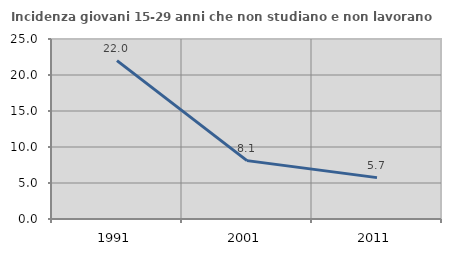
| Category | Incidenza giovani 15-29 anni che non studiano e non lavorano  |
|---|---|
| 1991.0 | 22 |
| 2001.0 | 8.108 |
| 2011.0 | 5.747 |